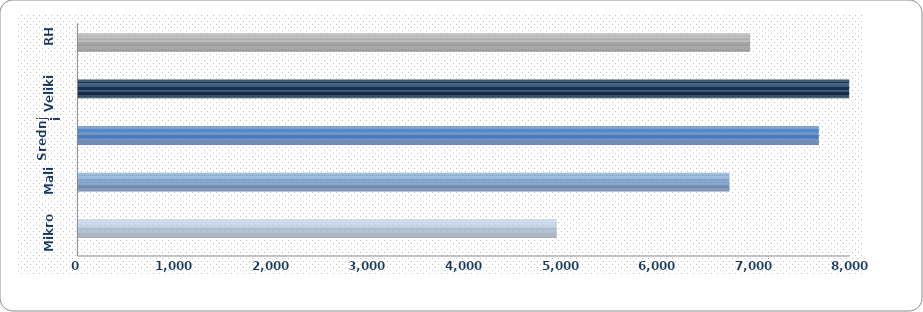
| Category | Mikro Mali Srednji Veliki |
|---|---|
| Mikro | 4970.423 |
| Mali | 6759.187 |
| Srednji | 7685.243 |
| Veliki | 8724.273 |
| RH | 6973.457 |